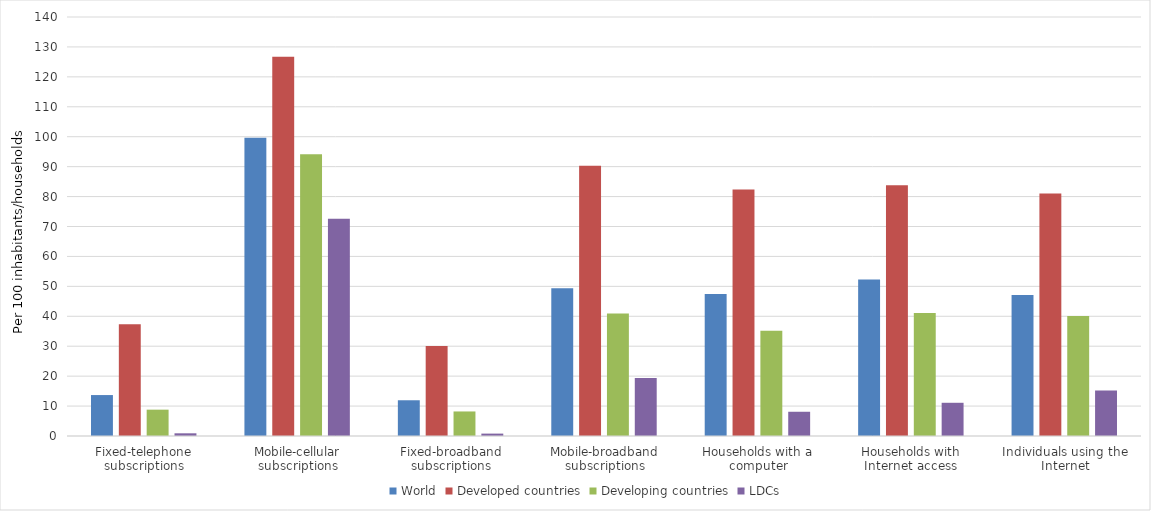
| Category | World | Developed countries | Developing countries | LDCs |
|---|---|---|---|---|
| Fixed-telephone subscriptions | 13.681 | 37.3 | 8.8 | 0.9 |
| Mobile-cellular subscriptions | 99.664 | 126.7 | 94.1 | 72.6 |
| Fixed-broadband subscriptions | 11.941 | 30.1 | 8.2 | 0.8 |
| Mobile-broadband subscriptions | 49.36 | 90.3 | 40.9 | 19.4 |
| Households with a computer | 47.471 | 82.4 | 35.2 | 8.1 |
| Households with Internet access | 52.267 | 83.8 | 41.1 | 11.1 |
| Individuals using the Internet | 47.122 | 81 | 40.1 | 15.2 |